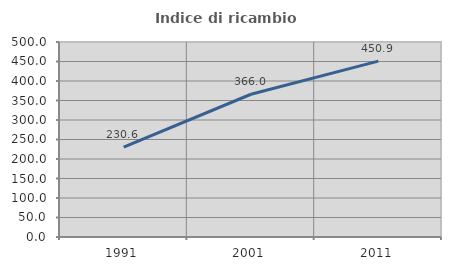
| Category | Indice di ricambio occupazionale  |
|---|---|
| 1991.0 | 230.645 |
| 2001.0 | 366.019 |
| 2011.0 | 450.862 |